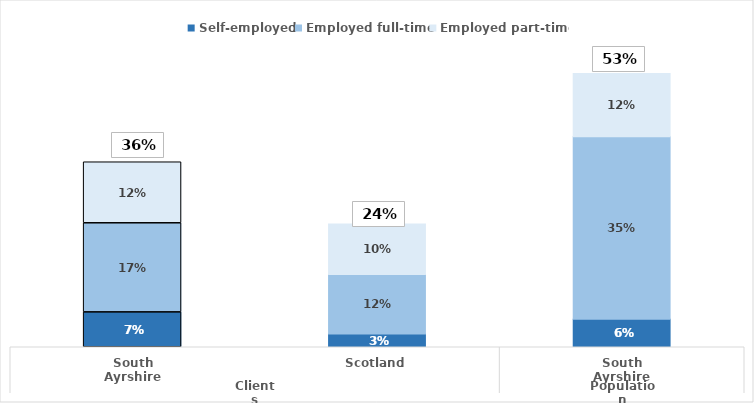
| Category | Self-employed | Employed full-time | Employed part-time |
|---|---|---|---|
| 0 | 0.068 | 0.173 | 0.119 |
| 1 | 0.026 | 0.116 | 0.098 |
| 2 | 0.055 | 0.354 | 0.123 |